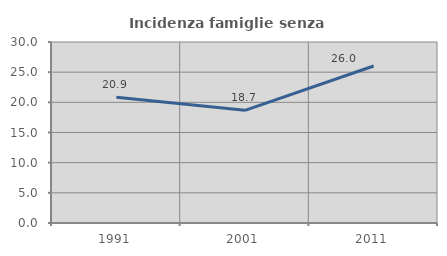
| Category | Incidenza famiglie senza nuclei |
|---|---|
| 1991.0 | 20.86 |
| 2001.0 | 18.677 |
| 2011.0 | 26.025 |